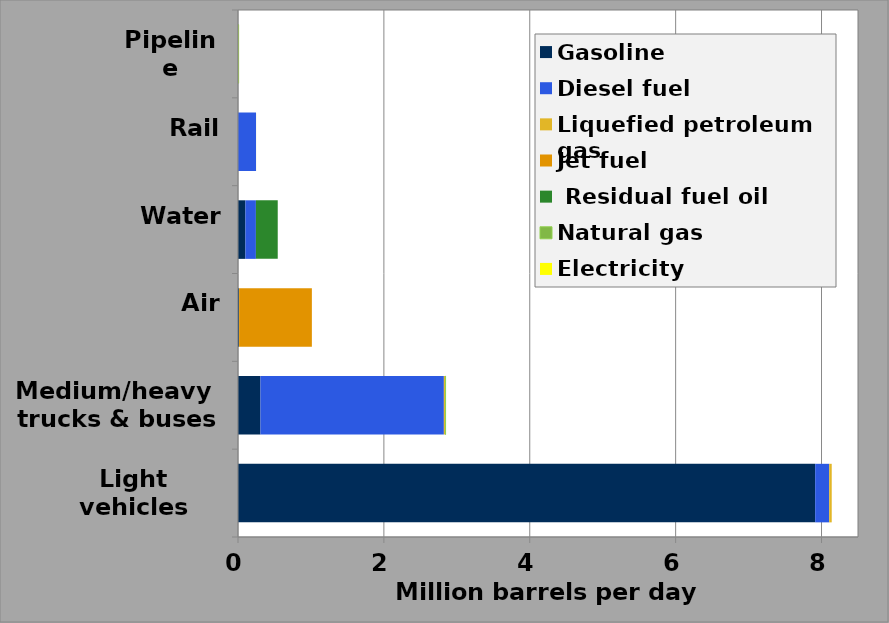
| Category | Gasoline | Diesel fuel | Liquefied petroleum gas | Jet fuel |  Residual fuel oil | Natural gas | Electricity |
|---|---|---|---|---|---|---|---|
| Light vehicles | 7.913 | 0.192 | 0.035 | 0 | 0 | 0 | 0 |
| Medium/heavy 
trucks & buses | 0.307 | 2.515 | 0.015 | 0 | 0 | 0.008 | 0 |
| Air | 0.015 | 0 | 0 | 0.998 | 0 | 0 | 0 |
| Water | 0.102 | 0.144 | 0 | 0 | 0.299 | 0 | 0 |
| Rail | 0 | 0.247 | 0 | 0 | 0 | 0 | 0.001 |
| Pipeline | 0 | 0 | 0 | 0 | 0 | 0.008 | 0.002 |